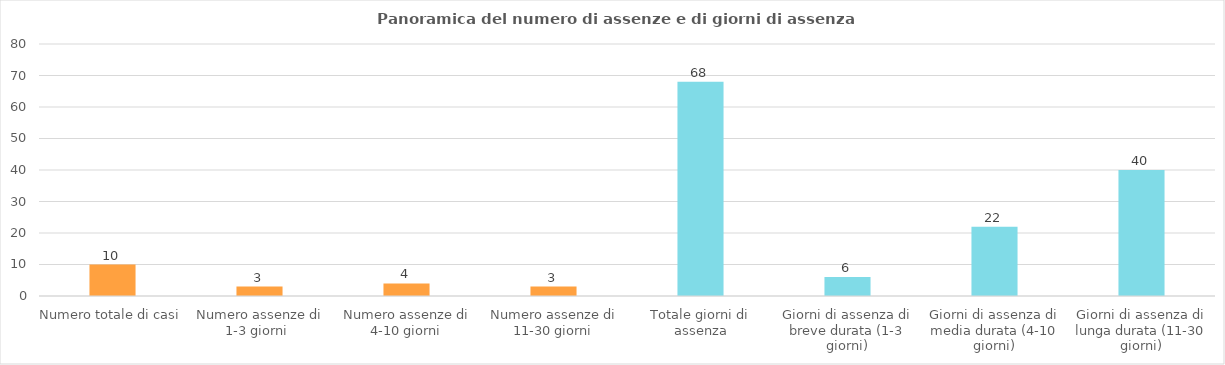
| Category | Totale complessivo |
|---|---|
| Numero totale di casi | 10 |
| Numero assenze di 1-3 giorni  | 3 |
| Numero assenze di 4-10 giorni | 4 |
| Numero assenze di 11-30 giorni | 3 |
| Totale giorni di assenza | 68 |
| Giorni di assenza di breve durata (1-3 giorni) | 6 |
| Giorni di assenza di media durata (4-10 giorni) | 22 |
| Giorni di assenza di lunga durata (11-30 giorni) | 40 |